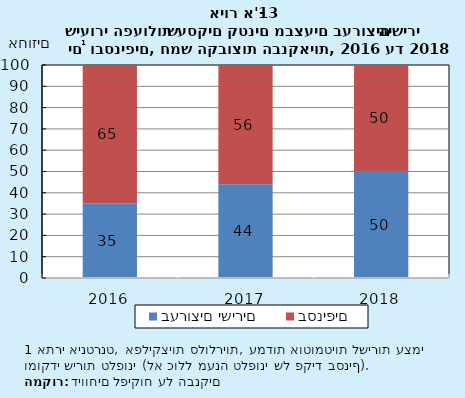
| Category | בערוצים ישירים | בסניפים |
|---|---|---|
| 2016.0 | 35.134 | 65 |
| 2017.0 | 43.968 | 56.032 |
| 2018.0 | 50.006 | 49.994 |